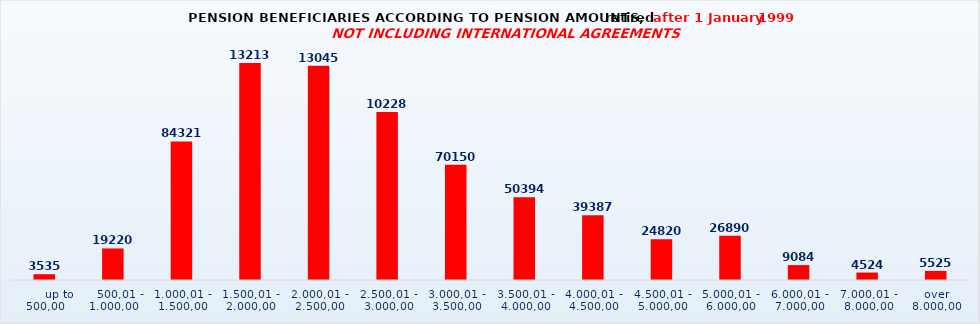
| Category | Series 0 |
|---|---|
|       up to 500,00 | 3535 |
|    500,01 - 1.000,00 | 19220 |
| 1.000,01 - 1.500,00 | 84321 |
| 1.500,01 - 2.000,00 | 132137 |
| 2.000,01 - 2.500,00 | 130458 |
| 2.500,01 - 3.000,00 | 102284 |
| 3.000,01 - 3.500,00 | 70150 |
| 3.500,01 - 4.000,00 | 50394 |
| 4.000,01 - 4.500,00 | 39387 |
| 4.500,01 - 5.000,00 | 24820 |
| 5.000,01 - 6.000,00 | 26890 |
| 6.000,01 - 7.000,00 | 9084 |
| 7.000,01 - 8.000,00 | 4524 |
| over 8.000,00 | 5525 |